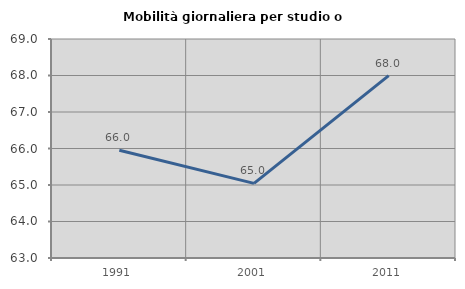
| Category | Mobilità giornaliera per studio o lavoro |
|---|---|
| 1991.0 | 65.954 |
| 2001.0 | 65.043 |
| 2011.0 | 67.997 |